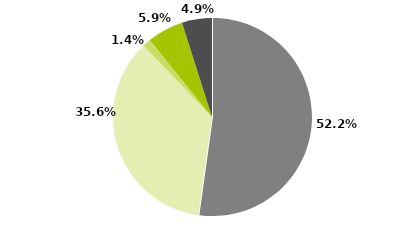
| Category | Series 0 |
|---|---|
| Multimercados Macro | 0.522 |
| Multimercados Livre | 0.356 |
| Long And Short - Neutro | 0.014 |
| Long And Short - Direcional | 0.059 |
| Outros | 0.049 |